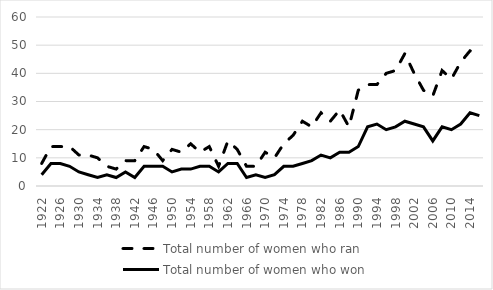
| Category | Total number of women who ran | Total number of women who won |
|---|---|---|
| 1922.0 | 8 | 4 |
| 1924.0 | 14 | 8 |
| 1926.0 | 14 | 8 |
| 1928.0 | 14 | 7 |
| 1930.0 | 11 | 5 |
| 1932.0 | 11 | 4 |
| 1934.0 | 10 | 3 |
| 1936.0 | 7 | 4 |
| 1938.0 | 6 | 3 |
| 1940.0 | 9 | 5 |
| 1942.0 | 9 | 3 |
| 1944.0 | 14 | 7 |
| 1946.0 | 13 | 7 |
| 1948.0 | 9 | 7 |
| 1950.0 | 13 | 5 |
| 1952.0 | 12 | 6 |
| 1954.0 | 15 | 6 |
| 1956.0 | 12 | 7 |
| 1958.0 | 14 | 7 |
| 1960.0 | 7 | 5 |
| 1962.0 | 16 | 8 |
| 1964.0 | 13 | 8 |
| 1966.0 | 7 | 3 |
| 1968.0 | 7 | 4 |
| 1970.0 | 12 | 3 |
| 1972.0 | 10 | 4 |
| 1974.0 | 15 | 7 |
| 1976.0 | 18 | 7 |
| 1978.0 | 23 | 8 |
| 1980.0 | 21 | 9 |
| 1982.0 | 26 | 11 |
| 1984.0 | 23 | 10 |
| 1986.0 | 27 | 12 |
| 1988.0 | 21 | 12 |
| 1990.0 | 34 | 14 |
| 1992.0 | 36 | 21 |
| 1994.0 | 36 | 22 |
| 1996.0 | 40 | 20 |
| 1998.0 | 41 | 21 |
| 2000.0 | 47 | 23 |
| 2002.0 | 40 | 22 |
| 2004.0 | 34 | 21 |
| 2006.0 | 32 | 16 |
| 2008.0 | 41 | 21 |
| 2010.0 | 38 | 20 |
| 2012.0 | 44 | 22 |
| 2014.0 | 48 | 26 |
| 2016.0 | 47 | 25 |